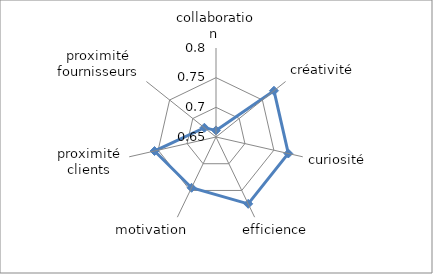
| Category | Series 0 |
|---|---|
| collaboration  | 0.661 |
| créativité | 0.775 |
| curiosité | 0.775 |
| efficience | 0.775 |
| motivation | 0.745 |
| proximité clients | 0.756 |
| proximité fournisseurs | 0.675 |